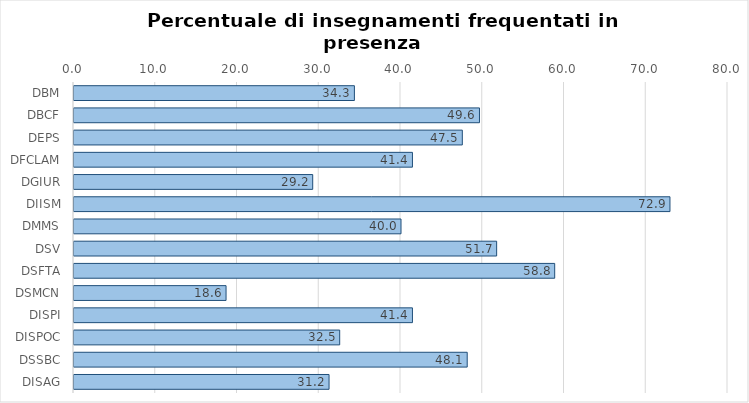
| Category | Series 0 |
|---|---|
| DBM | 34.3 |
| DBCF | 49.6 |
| DEPS | 47.5 |
| DFCLAM | 41.4 |
| DGIUR | 29.2 |
| DIISM | 72.9 |
| DMMS | 40 |
| DSV | 51.7 |
| DSFTA | 58.8 |
| DSMCN | 18.6 |
| DISPI | 41.4 |
| DISPOC | 32.5 |
| DSSBC | 48.1 |
| DISAG | 31.2 |